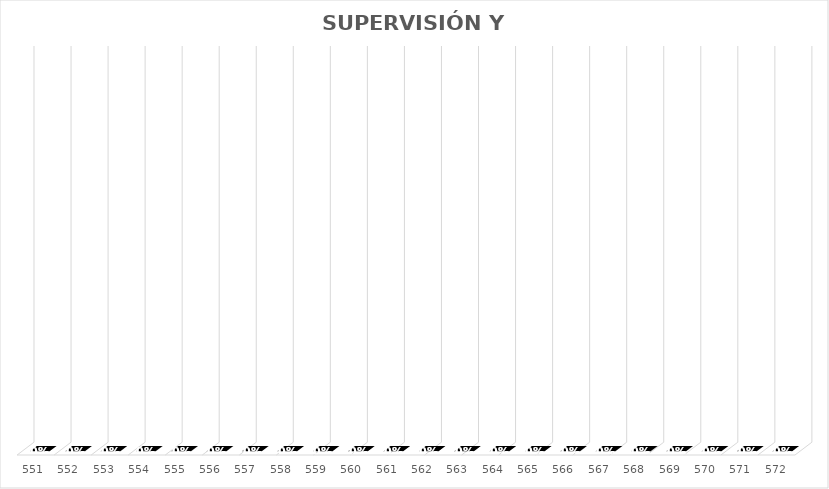
| Category | % Avance |
|---|---|
| 551.0 | 0 |
| 552.0 | 0 |
| 553.0 | 0 |
| 554.0 | 0 |
| 555.0 | 0 |
| 556.0 | 0 |
| 557.0 | 0 |
| 558.0 | 0 |
| 559.0 | 0 |
| 560.0 | 0 |
| 561.0 | 0 |
| 562.0 | 0 |
| 563.0 | 0 |
| 564.0 | 0 |
| 565.0 | 0 |
| 566.0 | 0 |
| 567.0 | 0 |
| 568.0 | 0 |
| 569.0 | 0 |
| 570.0 | 0 |
| 571.0 | 0 |
| 572.0 | 0 |